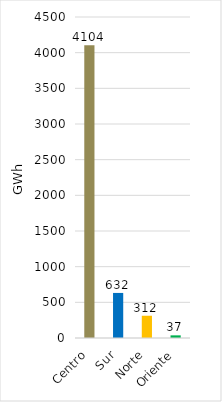
| Category | Series 0 |
|---|---|
| Centro | 4103.904 |
| Sur | 631.759 |
| Norte | 311.811 |
| Oriente | 37.093 |